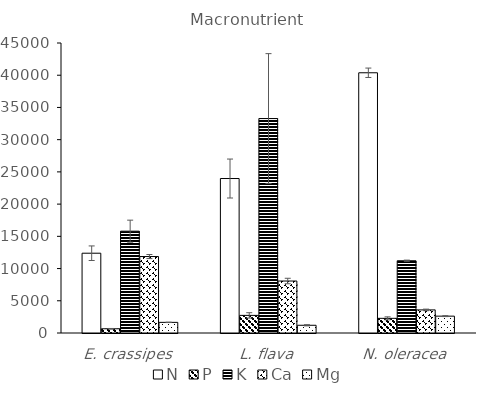
| Category | N | P | K | Ca | Mg |
|---|---|---|---|---|---|
| E. crassipes | 12380 | 657 | 15799 | 11863.5 | 1649 |
| L. flava | 23970 | 2734.5 | 33276 | 8066.5 | 1198.5 |
| N. oleracea | 40380 | 2275 | 11212 | 3583 | 2616 |